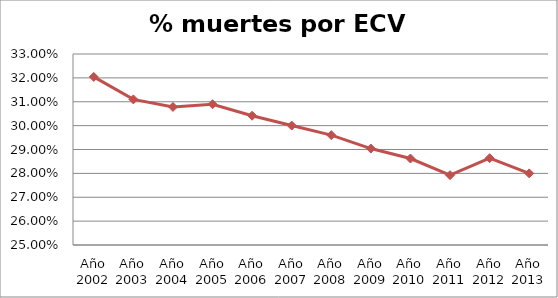
| Category | Series 0 |
|---|---|
| Año 2002 | 0.32 |
| Año 2003 | 0.311 |
| Año 2004 | 0.308 |
| Año 2005 | 0.309 |
| Año 2006 | 0.304 |
| Año 2007 | 0.3 |
| Año 2008 | 0.296 |
| Año 2009 | 0.29 |
| Año 2010 | 0.286 |
| Año 2011 | 0.279 |
| Año 2012 | 0.286 |
| Año 2013 | 0.28 |